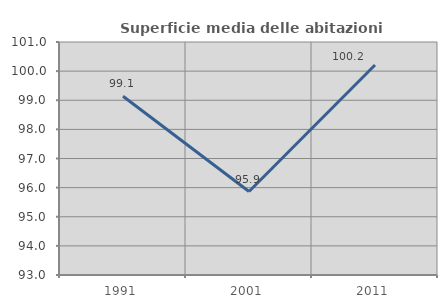
| Category | Superficie media delle abitazioni occupate |
|---|---|
| 1991.0 | 99.136 |
| 2001.0 | 95.867 |
| 2011.0 | 100.212 |